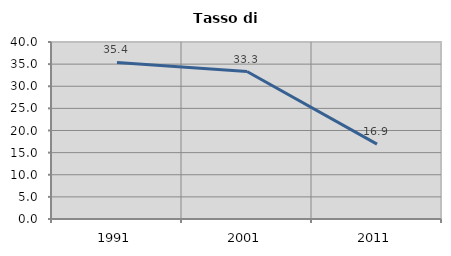
| Category | Tasso di disoccupazione   |
|---|---|
| 1991.0 | 35.394 |
| 2001.0 | 33.333 |
| 2011.0 | 16.925 |